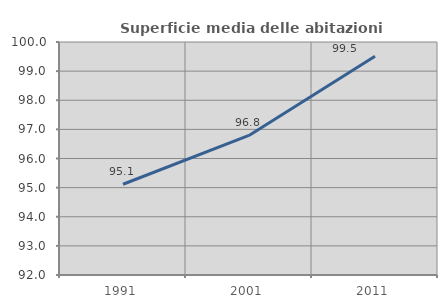
| Category | Superficie media delle abitazioni occupate |
|---|---|
| 1991.0 | 95.115 |
| 2001.0 | 96.792 |
| 2011.0 | 99.512 |